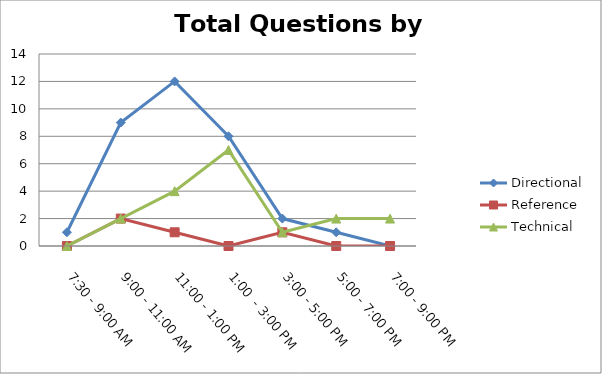
| Category | Directional | Reference | Technical |
|---|---|---|---|
| 7:30 - 9:00 AM | 1 | 0 | 0 |
| 9:00 - 11:00 AM | 9 | 2 | 2 |
| 11:00 - 1:00 PM | 12 | 1 | 4 |
| 1:00  - 3:00 PM | 8 | 0 | 7 |
| 3:00 - 5:00 PM | 2 | 1 | 1 |
| 5:00 - 7:00 PM | 1 | 0 | 2 |
| 7:00 - 9:00 PM | 0 | 0 | 2 |